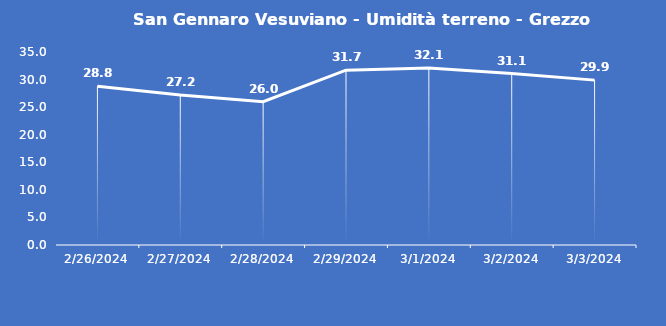
| Category | San Gennaro Vesuviano - Umidità terreno - Grezzo (%VWC) |
|---|---|
| 2/26/24 | 28.8 |
| 2/27/24 | 27.2 |
| 2/28/24 | 26 |
| 2/29/24 | 31.7 |
| 3/1/24 | 32.1 |
| 3/2/24 | 31.1 |
| 3/3/24 | 29.9 |